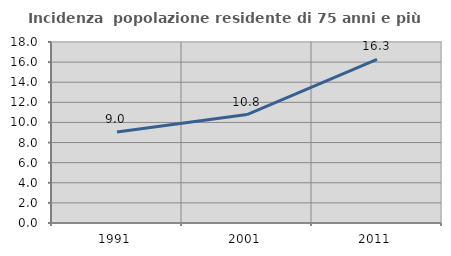
| Category | Incidenza  popolazione residente di 75 anni e più |
|---|---|
| 1991.0 | 9.039 |
| 2001.0 | 10.785 |
| 2011.0 | 16.266 |